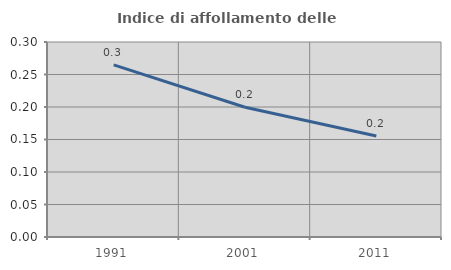
| Category | Indice di affollamento delle abitazioni  |
|---|---|
| 1991.0 | 0.265 |
| 2001.0 | 0.2 |
| 2011.0 | 0.155 |